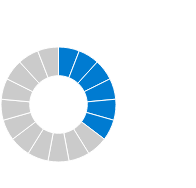
| Category | Effect from competitors' behaviour on the credit standards  |
|---|---|
| 0 | 1 |
| 1 | 1 |
| 2 | 1 |
| 3 | 1 |
| 4 | 1 |
| 5 | 1 |
| 6 | 1 |
| 7 | 1 |
| 8 | 1 |
| 9 | 1 |
| 10 | 1 |
| 11 | 1 |
| 12 | 1 |
| 13 | 1 |
| 14 | 1 |
| 15 | 1 |
| 16 | 1 |